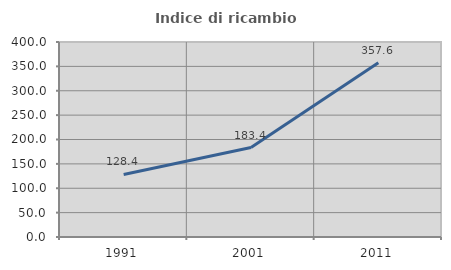
| Category | Indice di ricambio occupazionale  |
|---|---|
| 1991.0 | 128.394 |
| 2001.0 | 183.409 |
| 2011.0 | 357.634 |